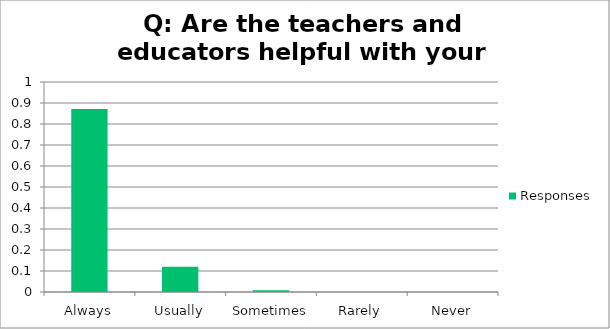
| Category | Responses |
|---|---|
| Always | 0.872 |
| Usually | 0.12 |
| Sometimes | 0.008 |
| Rarely | 0 |
| Never | 0 |